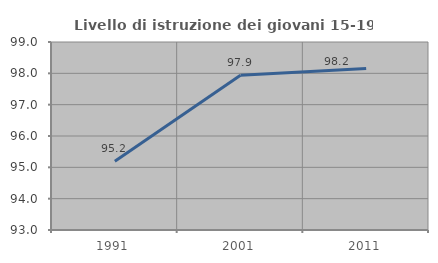
| Category | Livello di istruzione dei giovani 15-19 anni |
|---|---|
| 1991.0 | 95.191 |
| 2001.0 | 97.938 |
| 2011.0 | 98.151 |